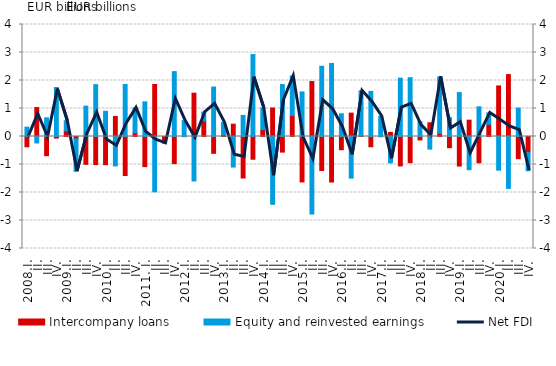
| Category | Intercompany loans | Equity and reinvested earnings |
|---|---|---|
| 2008.I. | -0.368 | 0.334 |
| II. | 1.034 | -0.231 |
| III. | -0.685 | 0.667 |
| IV. | -0.056 | 1.75 |
| 2009.I. | 0.204 | 0.359 |
| II. | -0.082 | -1.163 |
| III. | -0.994 | 1.084 |
| IV. | -1.003 | 1.852 |
| 2010.I. | -1.006 | 0.9 |
| II. | 0.714 | -1.049 |
| III. | -1.395 | 1.858 |
| IV. | 0.13 | 0.893 |
| 2011. I. | -1.076 | 1.238 |
| II. | 1.858 | -1.975 |
| III. | -0.199 | -0.045 |
| IV. | -0.968 | 2.317 |
| 2012.I. | -0.004 | 0.564 |
| II. | 1.547 | -1.589 |
| III. | 0.553 | 0.32 |
| IV. | -0.601 | 1.767 |
| 2013.I. | 0.068 | 0.429 |
| II. | 0.44 | -1.091 |
| III. | -1.483 | 0.753 |
| IV. | -0.811 | 2.927 |
| 2014.I. | 0.246 | 0.777 |
| II. | 1.019 | -2.421 |
| III. | -0.558 | 1.854 |
| IV. | 0.746 | 1.416 |
| 2015.I. | -1.622 | 1.593 |
| II. | 1.963 | -2.769 |
| III. | -1.215 | 2.509 |
| IV. | -1.626 | 2.607 |
| 2016.I. | -0.471 | 0.811 |
| II. | 0.835 | -1.486 |
| III. | 0.022 | 1.608 |
| IV. | -0.367 | 1.611 |
| 2017.I. | -0.008 | 0.724 |
| II. | 0.146 | -0.943 |
| III. | -1.051 | 2.083 |
| IV. | -0.935 | 2.099 |
| 2018.I. | -0.122 | 0.53 |
| II. | 0.489 | -0.45 |
| III. | 0.109 | 2.021 |
| IV. | -0.399 | 0.68 |
| 2019.I. | -1.056 | 1.569 |
| II. | 0.583 | -1.186 |
| III. | -0.939 | 1.061 |
| IV. | 0.432 | 0.41 |
| 2020.I. | 1.807 | -1.203 |
| II. | 2.212 | -1.853 |
| III. | -0.792 | 1.016 |
| IV. | -0.565 | -0.656 |